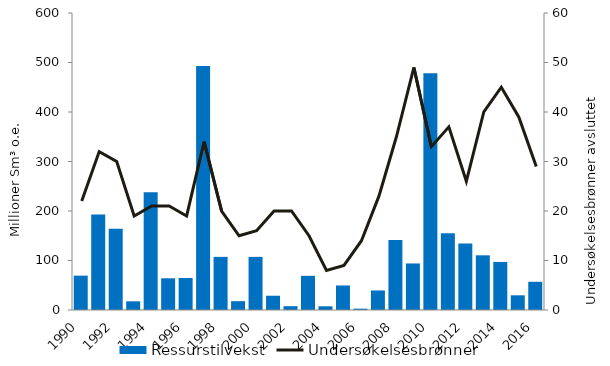
| Category | Ressurstilvekst |
|---|---|
| 1990.0 | 69.403 |
| 1991.0 | 192.721 |
| 1992.0 | 164.217 |
| 1993.0 | 17.571 |
| 1994.0 | 238.08 |
| 1995.0 | 64.063 |
| 1996.0 | 64.692 |
| 1997.0 | 492.88 |
| 1998.0 | 107.354 |
| 1999.0 | 17.857 |
| 2000.0 | 107.322 |
| 2001.0 | 28.834 |
| 2002.0 | 7.737 |
| 2003.0 | 69.031 |
| 2004.0 | 7.492 |
| 2005.0 | 49.559 |
| 2006.0 | 2.711 |
| 2007.0 | 39.482 |
| 2008.0 | 141.491 |
| 2009.0 | 94.017 |
| 2010.0 | 478.107 |
| 2011.0 | 154.965 |
| 2012.0 | 134.492 |
| 2013.0 | 110.464 |
| 2014.0 | 97.101 |
| 2015.0 | 29.697 |
| 2016.0 | 57 |